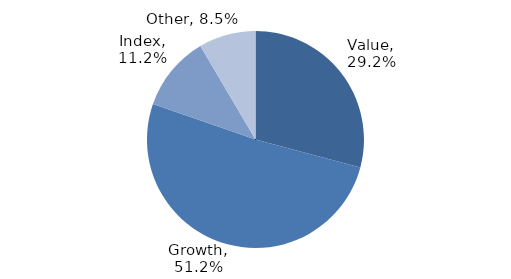
| Category | Investment Style |
|---|---|
| Value | 0.292 |
| Growth | 0.512 |
| Index | 0.112 |
| Other | 0.085 |